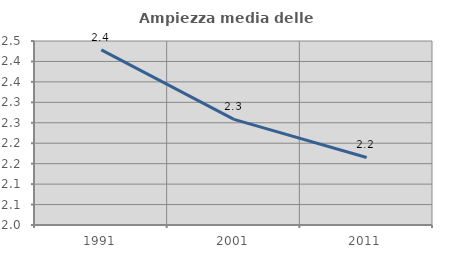
| Category | Ampiezza media delle famiglie |
|---|---|
| 1991.0 | 2.428 |
| 2001.0 | 2.258 |
| 2011.0 | 2.165 |